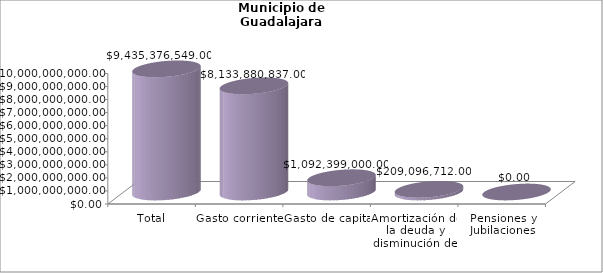
| Category | Municipio de Guadalajara
Tipo de Gasto de los ejercicios fiscales 2017-2022 |
|---|---|
| Total | 9435376548.998 |
| Gasto corriente | 8133880836.998 |
| Gasto de capital | 1092399000 |
| Amortización de la deuda y disminución de pasivos | 209096712 |
| Pensiones y Jubilaciones | 0 |